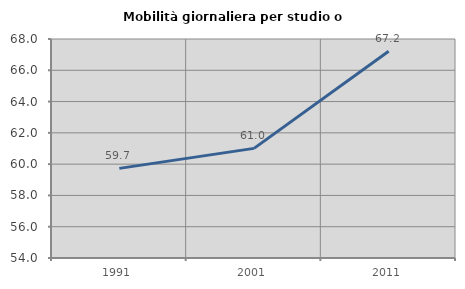
| Category | Mobilità giornaliera per studio o lavoro |
|---|---|
| 1991.0 | 59.73 |
| 2001.0 | 61.008 |
| 2011.0 | 67.218 |